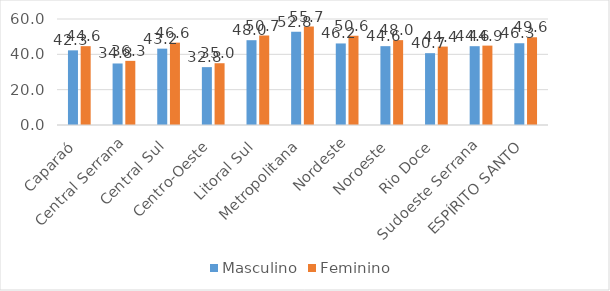
| Category | Masculino | Feminino  |
|---|---|---|
| Caparaó | 42.257 | 44.619 |
| Central Serrana | 34.824 | 36.305 |
| Central Sul | 43.213 | 46.614 |
| Centro-Oeste | 32.753 | 34.961 |
| Litoral Sul | 48.001 | 50.655 |
| Metropolitana | 52.79 | 55.725 |
| Nordeste | 46.162 | 50.559 |
| Noroeste | 44.625 | 48.029 |
| Rio Doce | 40.657 | 44.389 |
| Sudoeste Serrana | 44.607 | 44.937 |
| ESPÍRITO SANTO | 46.278 | 49.627 |